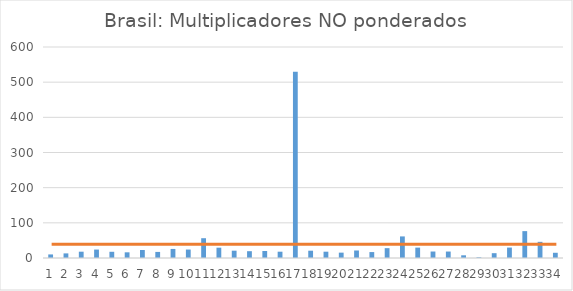
| Category | Series 0 |
|---|---|
| 0 | 10.142 |
| 1 | 13.108 |
| 2 | 17.932 |
| 3 | 24.013 |
| 4 | 17.668 |
| 5 | 16.166 |
| 6 | 22.714 |
| 7 | 17.276 |
| 8 | 25.76 |
| 9 | 24.055 |
| 10 | 56.27 |
| 11 | 29.33 |
| 12 | 20.8 |
| 13 | 19.373 |
| 14 | 19.974 |
| 15 | 17.916 |
| 16 | 529.888 |
| 17 | 20.743 |
| 18 | 17.94 |
| 19 | 15.252 |
| 20 | 21.365 |
| 21 | 16.861 |
| 22 | 27.985 |
| 23 | 61.382 |
| 24 | 29.549 |
| 25 | 18.415 |
| 26 | 18.369 |
| 27 | 7.688 |
| 28 | 1.932 |
| 29 | 13.709 |
| 30 | 29.669 |
| 31 | 76.413 |
| 32 | 45.967 |
| 33 | 14.842 |